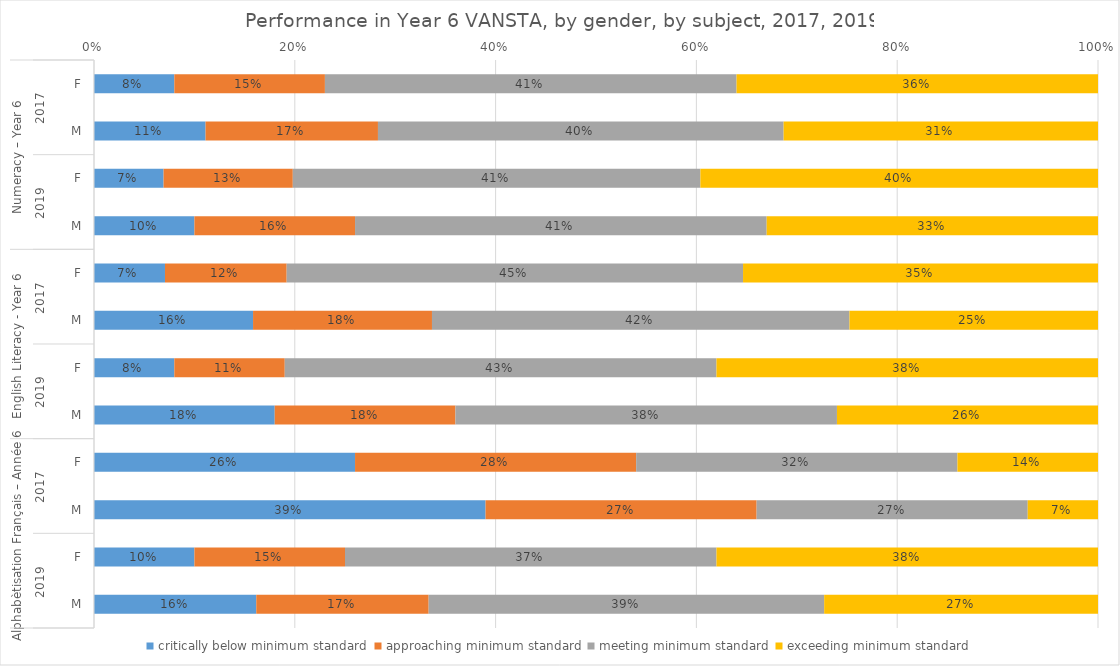
| Category | critically below minimum standard | approaching minimum standard | meeting minimum standard | exceeding minimum standard |
|---|---|---|---|---|
| 0 | 0.08 | 0.15 | 0.41 | 0.36 |
| 1 | 0.11 | 0.17 | 0.4 | 0.31 |
| 2 | 0.07 | 0.13 | 0.41 | 0.4 |
| 3 | 0.1 | 0.16 | 0.41 | 0.33 |
| 4 | 0.07 | 0.12 | 0.45 | 0.35 |
| 5 | 0.16 | 0.18 | 0.42 | 0.25 |
| 6 | 0.08 | 0.11 | 0.43 | 0.38 |
| 7 | 0.18 | 0.18 | 0.38 | 0.26 |
| 8 | 0.26 | 0.28 | 0.32 | 0.14 |
| 9 | 0.39 | 0.27 | 0.27 | 0.07 |
| 10 | 0.1 | 0.15 | 0.37 | 0.38 |
| 11 | 0.16 | 0.17 | 0.39 | 0.27 |